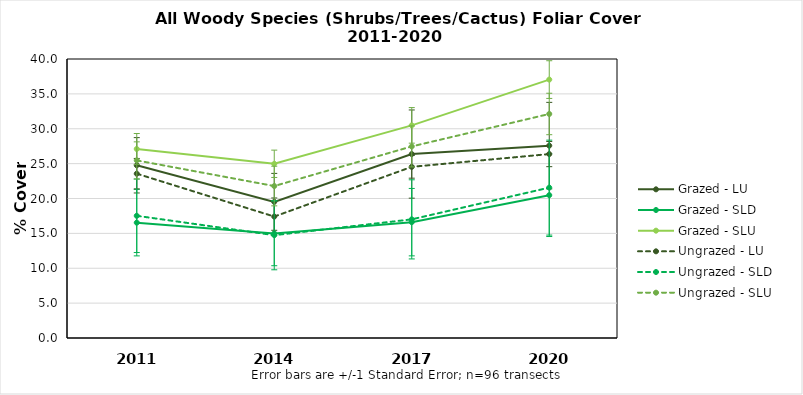
| Category | Grazed - LU | Grazed - SLD | Grazed - SLU | Ungrazed - LU | Ungrazed - SLD | Ungrazed - SLU |
|---|---|---|---|---|---|---|
| 2011.0 | 24.76 | 16.54 | 27.102 | 23.56 | 17.52 | 25.462 |
| 2014.0 | 19.52 | 15 | 24.975 | 17.41 | 14.74 | 21.787 |
| 2017.0 | 26.37 | 16.61 | 30.485 | 24.54 | 17.01 | 27.465 |
| 2020.0 | 27.58 | 20.48 | 37.05 | 26.37 | 21.56 | 32.119 |